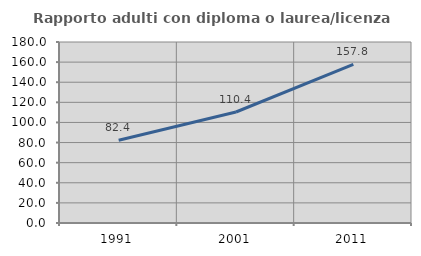
| Category | Rapporto adulti con diploma o laurea/licenza media  |
|---|---|
| 1991.0 | 82.371 |
| 2001.0 | 110.375 |
| 2011.0 | 157.842 |